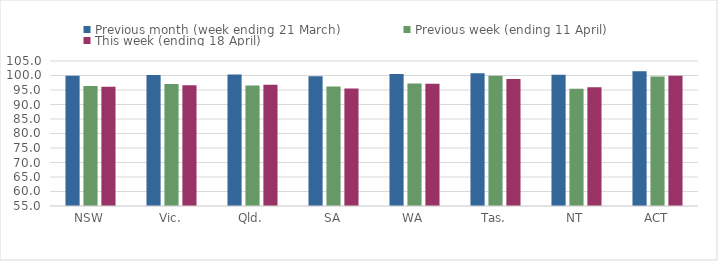
| Category | Previous month (week ending 21 March) | Previous week (ending 11 April) | This week (ending 18 April) |
|---|---|---|---|
| NSW | 99.907 | 96.344 | 96.104 |
| Vic. | 100.154 | 97.07 | 96.678 |
| Qld. | 100.32 | 96.509 | 96.799 |
| SA | 99.766 | 96.215 | 95.542 |
| WA | 100.478 | 97.201 | 97.176 |
| Tas. | 100.77 | 99.912 | 98.82 |
| NT | 100.218 | 95.469 | 95.947 |
| ACT | 101.476 | 99.684 | 99.917 |